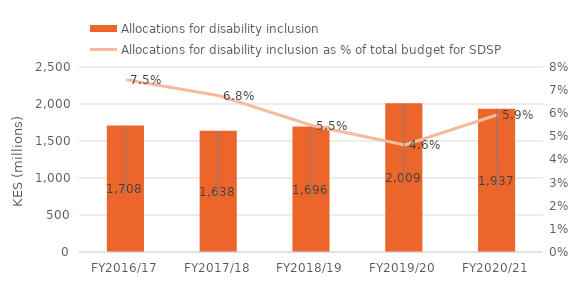
| Category | Allocations for disability inclusion |
|---|---|
| FY2016/17 | 1708291130 |
| FY2017/18 | 1637533510 |
| FY2018/19 | 1695643297 |
| FY2019/20 | 2008814850 |
| FY2020/21 | 1937485685 |